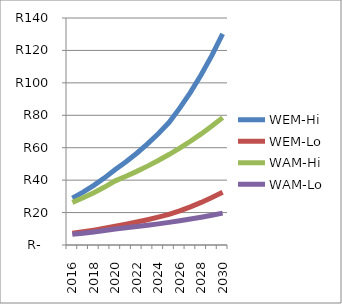
| Category | WEM-Hi | WEM-Lo | WAM-Hi | WAM-Lo |
|---|---|---|---|---|
| 2016.0 | 28.93 | 7.233 | 26.292 | 6.573 |
| 2017.0 | 32.623 | 8.156 | 29.124 | 7.281 |
| 2018.0 | 36.764 | 9.191 | 32.26 | 8.065 |
| 2019.0 | 41.408 | 10.352 | 35.731 | 8.933 |
| 2020.0 | 46.612 | 11.653 | 39.575 | 9.894 |
| 2021.0 | 51.377 | 12.844 | 42.394 | 10.598 |
| 2022.0 | 56.605 | 14.151 | 45.411 | 11.353 |
| 2023.0 | 62.341 | 15.585 | 48.639 | 12.16 |
| 2024.0 | 68.632 | 17.158 | 52.094 | 13.023 |
| 2025.0 | 75.531 | 18.883 | 55.789 | 13.947 |
| 2026.0 | 84.39 | 21.097 | 59.749 | 14.937 |
| 2027.0 | 94.183 | 23.546 | 63.986 | 15.997 |
| 2028.0 | 105.003 | 26.251 | 68.519 | 17.13 |
| 2029.0 | 116.951 | 29.238 | 73.367 | 18.342 |
| 2030.0 | 130.139 | 32.535 | 78.552 | 19.638 |